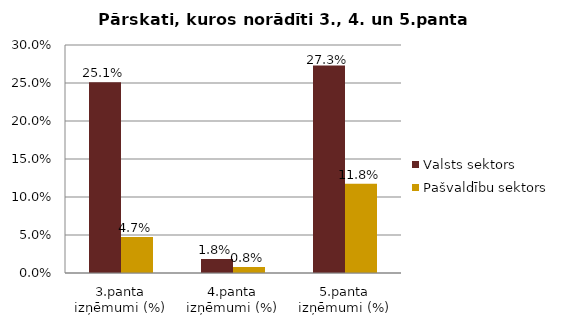
| Category | Valsts sektors | Pašvaldību sektors |
|---|---|---|
| 3.panta izņēmumi (%) | 0.251 | 0.047 |
| 4.panta izņēmumi (%) | 0.018 | 0.008 |
| 5.panta izņēmumi (%) | 0.273 | 0.118 |